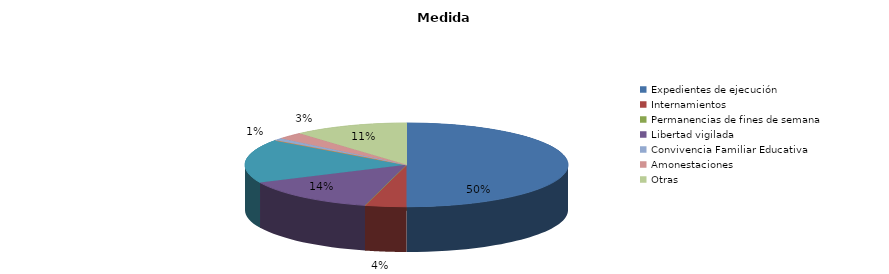
| Category | Series 0 |
|---|---|
| Expedientes de ejecución | 266 |
| Internamientos | 22 |
| Permanencias de fines de semana | 0 |
| Libertad vigilada | 74 |
| Prestaciones en beneficio de la comunidad | 90 |
| Privación de permisos y licencias | 0 |
| Convivencia Familiar Educativa | 5 |
| Amonestaciones | 14 |
| Otras | 61 |